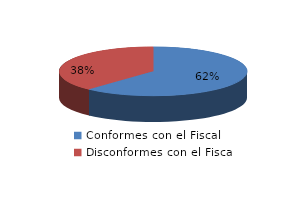
| Category | Series 0 |
|---|---|
| 0 | 52 |
| 1 | 32 |